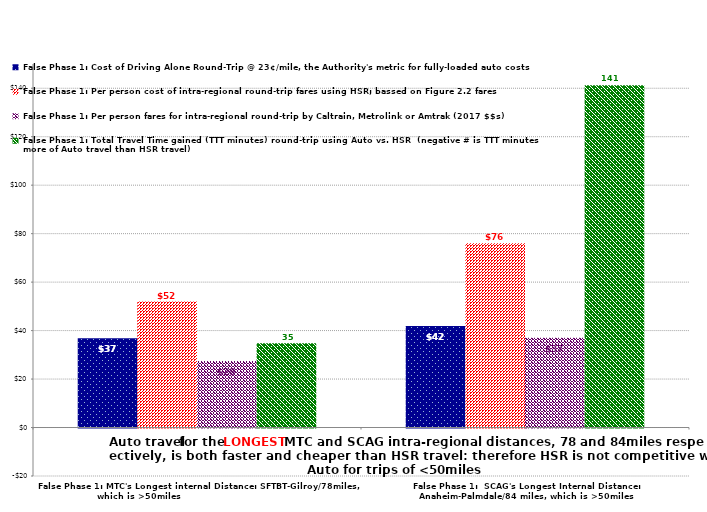
| Category | False Phase 1: Cost of Driving Alone Round-Trip @ 23¢/mile, the Authority's metric for fully-loaded auto costs | False Phase 1: Per person cost of intra-regional round-trip fares using HSR; bassed on Figure 2.2 fares | False Phase 1: Per person fares for intra-regional round-trip by Caltrain, Metrolink or Amtrak (2017 $$s) | False Phase 1: Total Travel Time gained (TTT minutes) round-trip using Auto vs. HSR  (negative # is TTT minutes more of Auto travel than HSR travel) |
|---|---|---|---|---|
| False Phase 1: MTC's Longest internal Distance: SFTBT-Gilroy/78miles, which is >50miles                                            | 36.8 | 52 | 27.5 | 34.8 |
| False Phase 1:  SCAG's Longest Internal Distance: Anaheim-Palmdale/84 miles, which is >50miles | 41.86 | 76 | 37 | 141.2 |